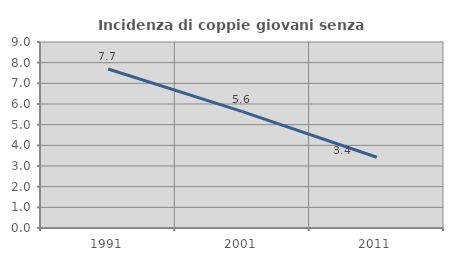
| Category | Incidenza di coppie giovani senza figli |
|---|---|
| 1991.0 | 7.692 |
| 2001.0 | 5.628 |
| 2011.0 | 3.423 |